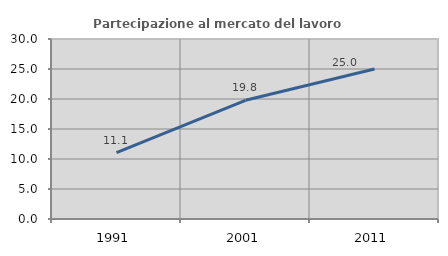
| Category | Partecipazione al mercato del lavoro  femminile |
|---|---|
| 1991.0 | 11.055 |
| 2001.0 | 19.786 |
| 2011.0 | 25 |